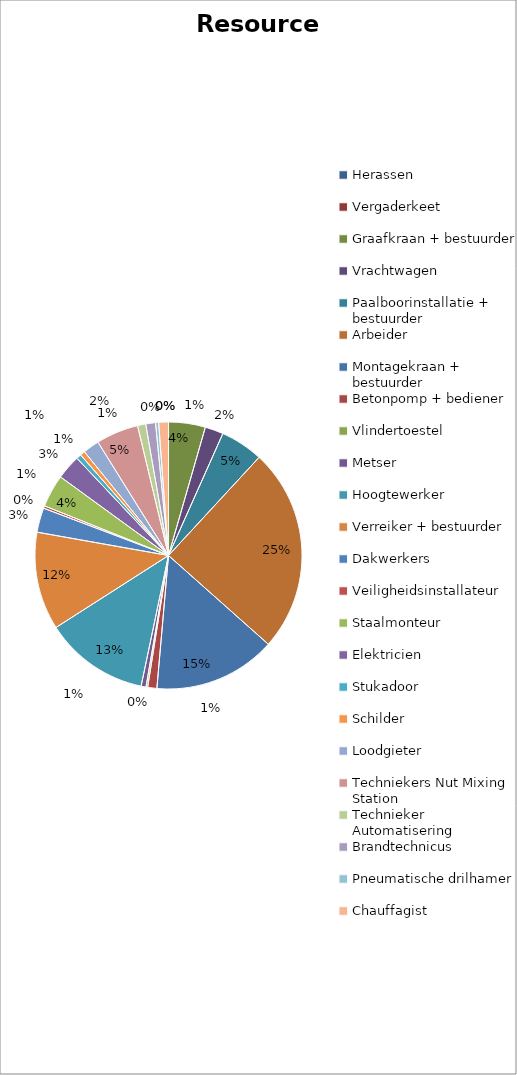
| Category | data |
|---|---|
| Herassen | 0 |
| Vergaderkeet | 0 |
| Graafkraan + bestuurder | 7200 |
| Vrachtwagen | 3600 |
| Paalboorinstallatie + bestuurder | 8400 |
| Arbeider | 40000 |
| Montagekraan + bestuurder | 24000 |
| Betonpomp + bediener | 1800 |
| Vlindertoestel | 320 |
| Metser | 960 |
| Hoogtewerker | 20480 |
| Verreiker + bestuurder | 19200 |
| Dakwerkers | 4800 |
| Veiligheidsinstallateur | 480 |
| Staalmonteur | 6400 |
| Elektricien | 4800 |
| Stukadoor | 960 |
| Schilder | 960 |
| Loodgieter | 3200 |
| Techniekers Nut Mixing Station | 8320 |
| Technieker Automatisering | 1600 |
| Brandtechnicus | 1920 |
| Pneumatische drilhamer | 600 |
| Chauffagist | 1920 |